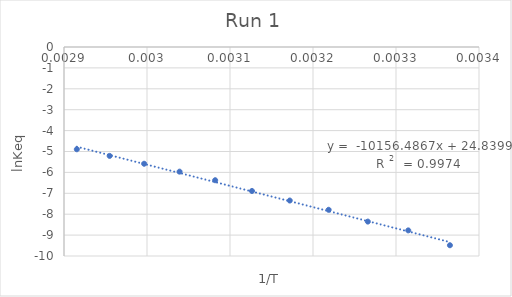
| Category | Series 0 |
|---|---|
| 0.003364963994885255 | -9.485 |
| 0.003314770617873243 | -8.775 |
| 0.0032660526487686982 | -8.354 |
| 0.0032188495831589788 | -7.789 |
| 0.003171985028230667 | -7.346 |
| 0.0031264655307175235 | -6.89 |
| 0.0030821390044691015 | -6.375 |
| 0.0030392365437802026 | -5.964 |
| 0.002996524032122737 | -5.586 |
| 0.002954995419757099 | -5.21 |
| 0.0029154518950437317 | -4.893 |